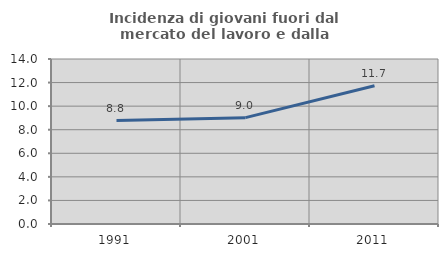
| Category | Incidenza di giovani fuori dal mercato del lavoro e dalla formazione  |
|---|---|
| 1991.0 | 8.772 |
| 2001.0 | 9.023 |
| 2011.0 | 11.723 |